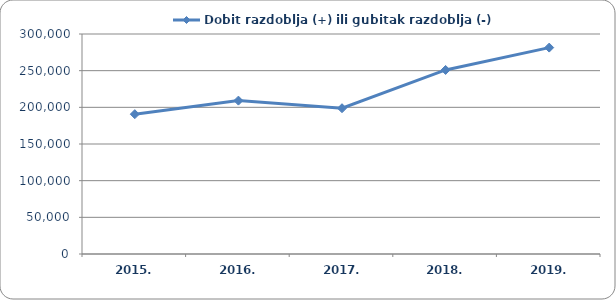
| Category | Dobit razdoblja (+) ili gubitak razdoblja (-)  |
|---|---|
| 2015. | 190653.381 |
| 2016. | 209158.624 |
| 2017. | 198773.716 |
| 2018. | 250983.665 |
| 2019. | 281446.119 |